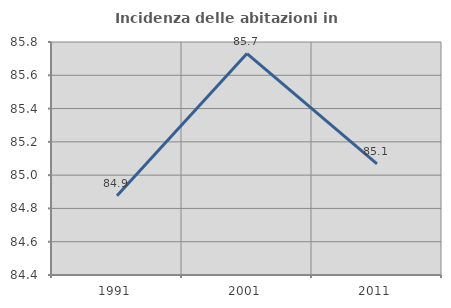
| Category | Incidenza delle abitazioni in proprietà  |
|---|---|
| 1991.0 | 84.876 |
| 2001.0 | 85.73 |
| 2011.0 | 85.068 |